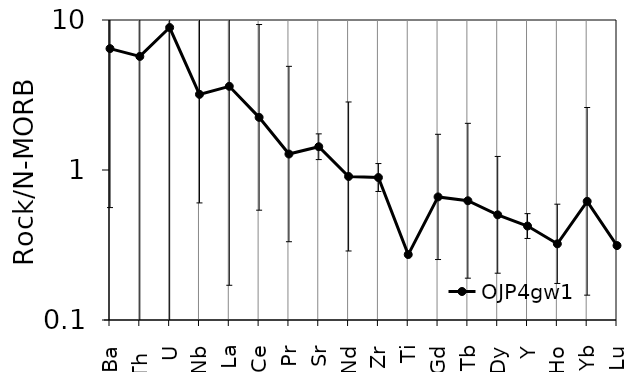
| Category | OJP4gw1 |
|---|---|
| Ba | 6.445 |
| Th  | 5.716 |
| U | 8.909 |
| Nb | 3.193 |
| La | 3.613 |
| Ce | 2.243 |
| Pr | 1.278 |
| Sr | 1.429 |
| Nd | 0.905 |
| Zr | 0.891 |
| Ti | 0.273 |
| Gd | 0.662 |
| Tb | 0.624 |
| Dy | 0.502 |
| Y | 0.423 |
| Ho | 0.322 |
| Yb | 0.618 |
| Lu | 0.313 |